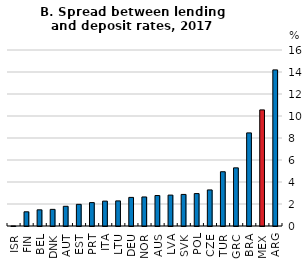
| Category | Series 0 |
|---|---|
| ISR | 0.031 |
| FIN | 129 |
| BEL | 147 |
| DNK | 151.248 |
| AUT | 179 |
| EST | 196.895 |
| PRT | 212.759 |
| ITA | 226.2 |
| LTU | 228.187 |
| DEU | 260 |
| NOR | 264 |
| AUS | 277.001 |
| LVA | 280.88 |
| SVK | 287 |
| POL | 294.652 |
| CZE | 327.849 |
| TUR | 493.212 |
| GRC | 528.645 |
| BRA | 846.333 |
| MEX | 1055.311 |
| ARG | 1419.192 |